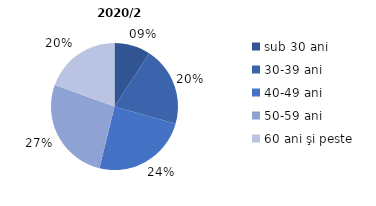
| Category | 2020/21 |
|---|---|
| sub 30 ani | 9.2 |
| 30-39 ani | 20.2 |
| 40-49 ani | 24.4 |
| 50-59 ani | 26.7 |
| 60 ani şi peste | 19.5 |